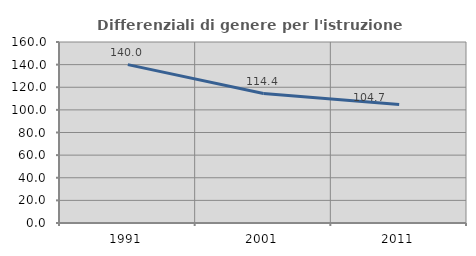
| Category | Differenziali di genere per l'istruzione superiore |
|---|---|
| 1991.0 | 139.974 |
| 2001.0 | 114.407 |
| 2011.0 | 104.714 |